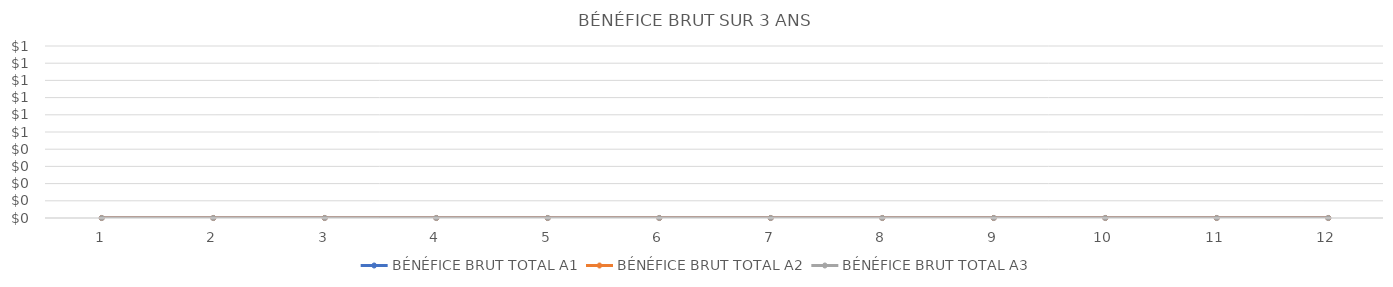
| Category | BÉNÉFICE BRUT TOTAL A1 | BÉNÉFICE BRUT TOTAL A2 | BÉNÉFICE BRUT TOTAL A3 |
|---|---|---|---|
| 0 | 0 | 0 | 0 |
| 1 | 0 | 0 | 0 |
| 2 | 0 | 0 | 0 |
| 3 | 0 | 0 | 0 |
| 4 | 0 | 0 | 0 |
| 5 | 0 | 0 | 0 |
| 6 | 0 | 0 | 0 |
| 7 | 0 | 0 | 0 |
| 8 | 0 | 0 | 0 |
| 9 | 0 | 0 | 0 |
| 10 | 0 | 0 | 0 |
| 11 | 0 | 0 | 0 |